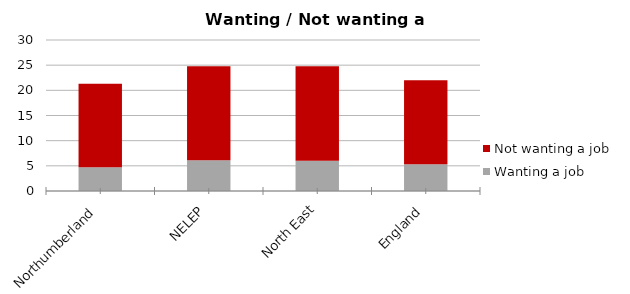
| Category | Wanting a job | Not wanting a job |
|---|---|---|
| Northumberland | 4.7 | 16.6 |
| NELEP | 6.1 | 18.7 |
| North East | 6 | 18.8 |
| England | 5.3 | 16.7 |